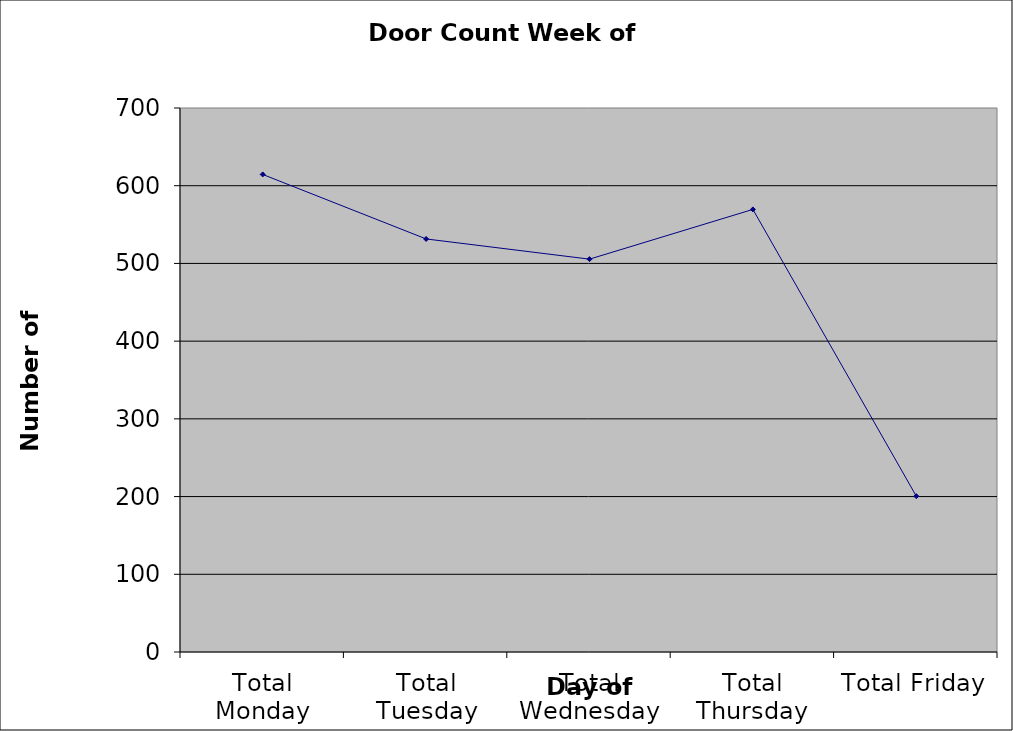
| Category | Series 0 |
|---|---|
| Total Monday | 614.5 |
| Total Tuesday | 531.5 |
| Total Wednesday | 505.5 |
| Total Thursday | 569.5 |
| Total Friday | 200.5 |